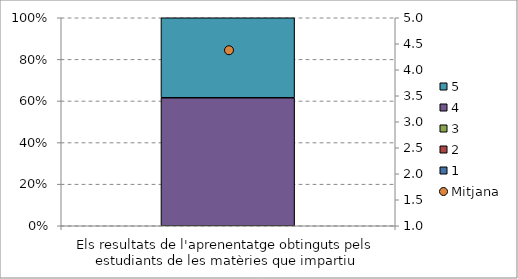
| Category | 1 | 2 | 3 | 4 | 5 |
|---|---|---|---|---|---|
| Els resultats de l'aprenentatge obtinguts pels estudiants de les matèries que impartiu | 0 | 0 | 0 | 0.615 | 0.385 |